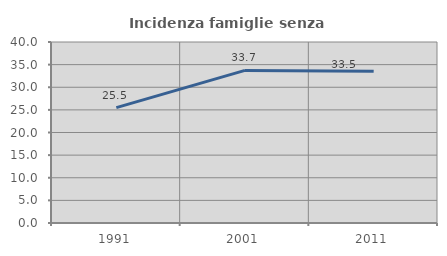
| Category | Incidenza famiglie senza nuclei |
|---|---|
| 1991.0 | 25.51 |
| 2001.0 | 33.724 |
| 2011.0 | 33.524 |